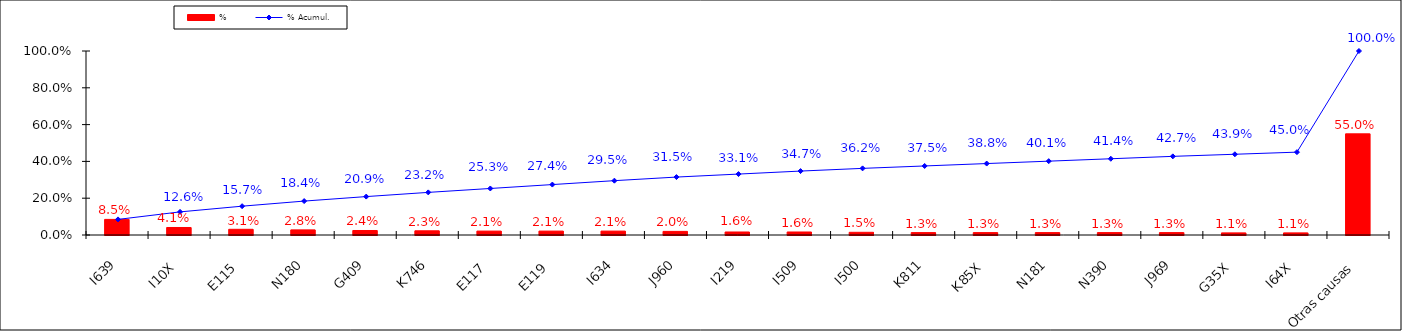
| Category | % |
|---|---|
| I639 | 0.085 |
| I10X | 0.041 |
| E115 | 0.031 |
| N180 | 0.028 |
| G409 | 0.024 |
| K746 | 0.023 |
| E117 | 0.021 |
| E119 | 0.021 |
| I634 | 0.021 |
| J960 | 0.02 |
| I219 | 0.016 |
| I509 | 0.016 |
| I500 | 0.015 |
| K811 | 0.013 |
| K85X | 0.013 |
| N181 | 0.013 |
| N390 | 0.013 |
| J969 | 0.013 |
| G35X | 0.011 |
| I64X | 0.011 |
| Otras causas | 0.55 |